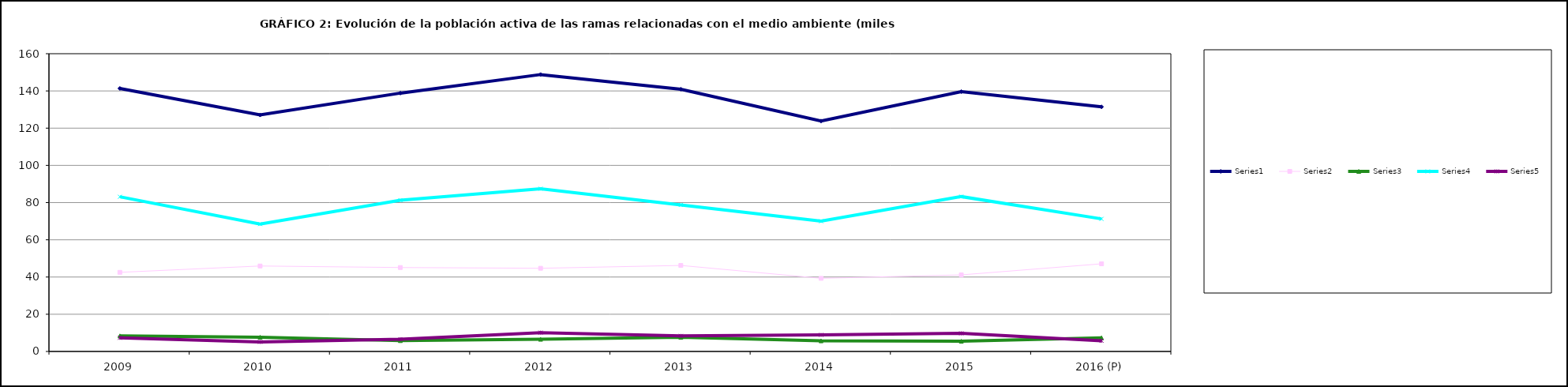
| Category | Series 0 | Series 1 | Series 2 | Series 3 | Series 4 |
|---|---|---|---|---|---|
| 2009 | 141.35 | 42.525 | 8.35 | 83.125 | 7.325 |
| 2010 | 127.075 | 45.925 | 7.65 | 68.45 | 5.1 |
| 2011 | 138.825 | 45.1 | 5.825 | 81.275 | 6.6 |
| 2012 | 148.8 | 44.7 | 6.55 | 87.45 | 10.125 |
| 2013 | 140.925 | 46.225 | 7.625 | 78.75 | 8.35 |
| 2014 | 123.8 | 39.3 | 5.7 | 70 | 8.9 |
| 2015 | 139.625 | 41.15 | 5.5 | 83.225 | 9.75 |
| 2016 (P) | 131.45 | 47.1 | 7.33 | 71.25 | 5.75 |